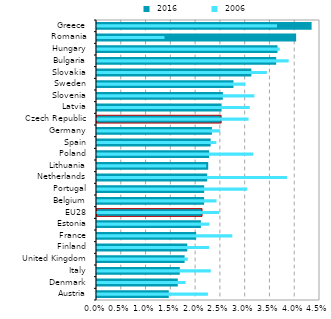
| Category |  2016 |
|---|---|
| Austria | 0.014 |
| Denmark | 0.016 |
| Italy | 0.017 |
| United Kingdom | 0.018 |
| Finland | 0.018 |
| France | 0.02 |
| Estonia | 0.021 |
| EU28 | 0.021 |
| Belgium | 0.022 |
| Portugal | 0.022 |
| Netherlands | 0.022 |
| Lithuania | 0.022 |
| Poland | 0.023 |
| Spain | 0.023 |
| Germany | 0.023 |
| Czech Republic | 0.025 |
| Latvia | 0.025 |
| Slovenia | 0.025 |
| Sweden | 0.028 |
| Slovakia | 0.031 |
| Bulgaria | 0.036 |
| Hungary | 0.036 |
| Romania | 0.04 |
| Greece | 0.043 |